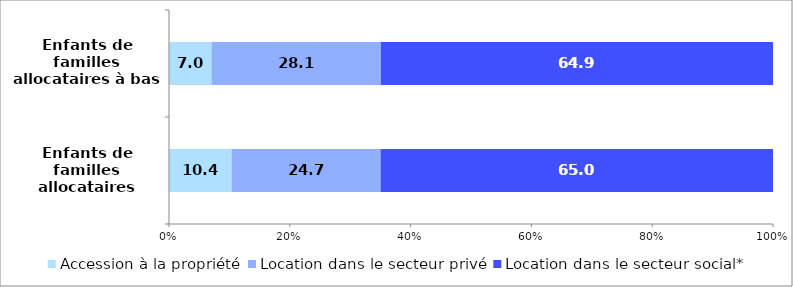
| Category | Accession à la propriété | Location dans le secteur privé | Location dans le secteur social* |
|---|---|---|---|
| Enfants de familles allocataires | 10.356 | 24.665 | 64.979 |
| Enfants de familles allocataires à bas revenus | 7.041 | 28.054 | 64.905 |